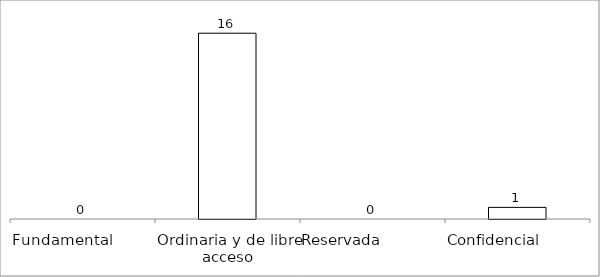
| Category | Series 0 |
|---|---|
| Fundamental         | 0 |
| Ordinaria y de libre acceso | 16 |
| Reservada               | 0 |
| Confidencial             | 1 |